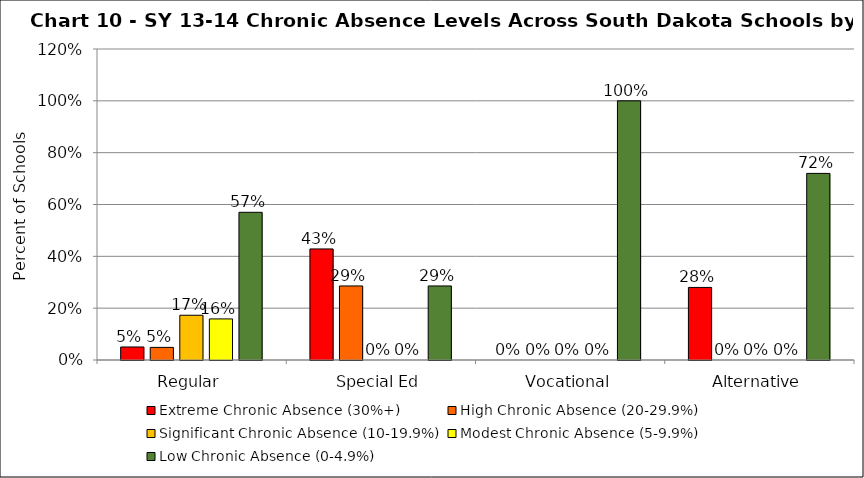
| Category | Extreme Chronic Absence (30%+) | High Chronic Absence (20-29.9%) | Significant Chronic Absence (10-19.9%) | Modest Chronic Absence (5-9.9%) | Low Chronic Absence (0-4.9%) |
|---|---|---|---|---|---|
| 0 | 0.05 | 0.049 | 0.173 | 0.159 | 0.57 |
| 1 | 0.429 | 0.286 | 0 | 0 | 0.286 |
| 2 | 0 | 0 | 0 | 0 | 1 |
| 3 | 0.28 | 0 | 0 | 0 | 0.72 |